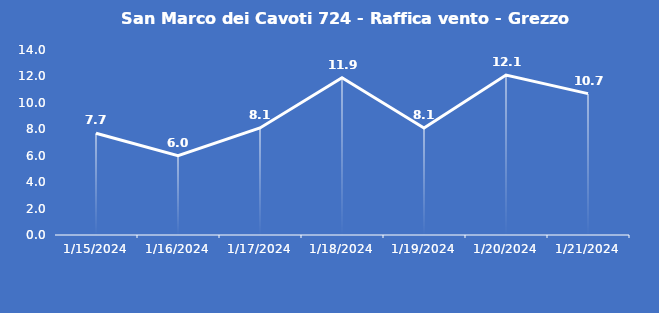
| Category | San Marco dei Cavoti 724 - Raffica vento - Grezzo (m/s) |
|---|---|
| 1/15/24 | 7.7 |
| 1/16/24 | 6 |
| 1/17/24 | 8.1 |
| 1/18/24 | 11.9 |
| 1/19/24 | 8.1 |
| 1/20/24 | 12.1 |
| 1/21/24 | 10.7 |